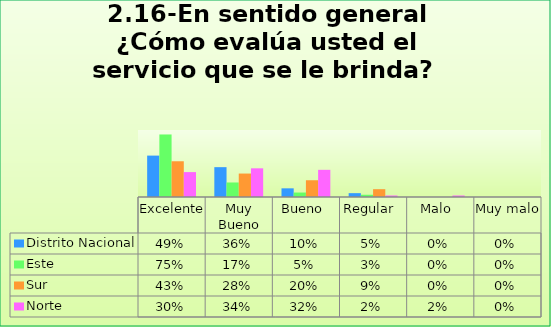
| Category | Distrito Nacional | Este | Sur  | Norte |
|---|---|---|---|---|
| Excelente | 0.494 | 0.747 | 0.427 | 0.297 |
| Muy Bueno | 0.356 | 0.173 | 0.28 | 0.342 |
| Bueno  | 0.103 | 0.053 | 0.2 | 0.324 |
| Regular  | 0.046 | 0.027 | 0.093 | 0.018 |
| Malo  | 0 | 0 | 0 | 0.018 |
| Muy malo  | 0 | 0 | 0 | 0 |